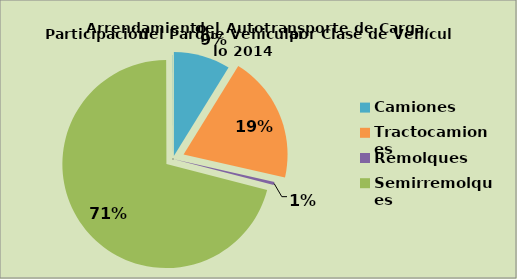
| Category | Series 0 |
|---|---|
| Camiones | 8.815 |
| Tractocamiones | 19.717 |
| Remolques | 0.491 |
| Semirremolques | 70.937 |
| Otros | 0.04 |